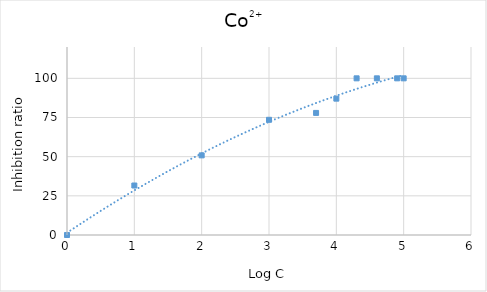
| Category | Co2+ |
|---|---|
| 0.0 | 0 |
| 1.0 | 31.592 |
| 2.0 | 50.831 |
| 3.0 | 73.53 |
| 3.6989700043360187 | 77.931 |
| 4.0 | 87.03 |
| 4.301029995663981 | 100 |
| 4.6020599913279625 | 100 |
| 4.903089986991944 | 100 |
| 5.0 | 100 |